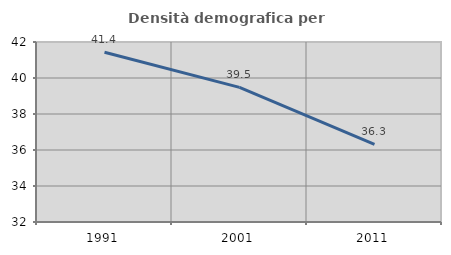
| Category | Densità demografica |
|---|---|
| 1991.0 | 41.428 |
| 2001.0 | 39.477 |
| 2011.0 | 36.316 |